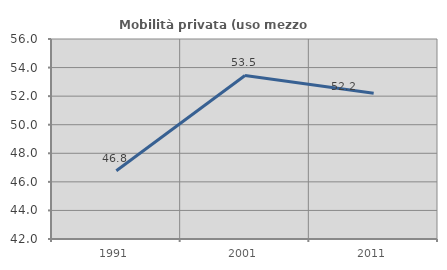
| Category | Mobilità privata (uso mezzo privato) |
|---|---|
| 1991.0 | 46.783 |
| 2001.0 | 53.45 |
| 2011.0 | 52.197 |